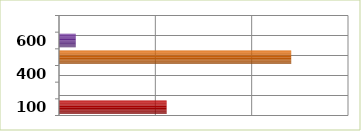
| Category | Series 0 |
|---|---|
| 100.0 | 111723128 |
| 200.0 | 0 |
| 400.0 | 0 |
| 500.0 | 241045436 |
| 600.0 | 17389569 |
| 700.0 | 0 |